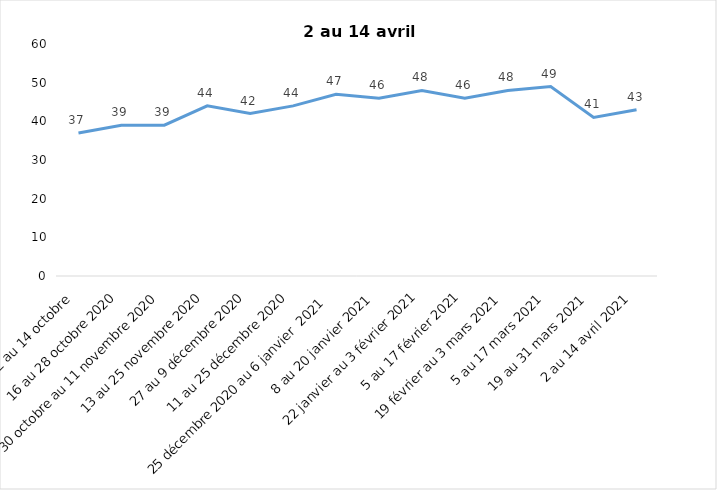
| Category | Toujours aux trois mesures |
|---|---|
| 2 au 14 octobre  | 37 |
| 16 au 28 octobre 2020 | 39 |
| 30 octobre au 11 novembre 2020 | 39 |
| 13 au 25 novembre 2020 | 44 |
| 27 au 9 décembre 2020 | 42 |
| 11 au 25 décembre 2020 | 44 |
| 25 décembre 2020 au 6 janvier  2021 | 47 |
| 8 au 20 janvier 2021 | 46 |
| 22 janvier au 3 février 2021 | 48 |
| 5 au 17 février 2021 | 46 |
| 19 février au 3 mars 2021 | 48 |
| 5 au 17 mars 2021 | 49 |
| 19 au 31 mars 2021 | 41 |
| 2 au 14 avril 2021 | 43 |